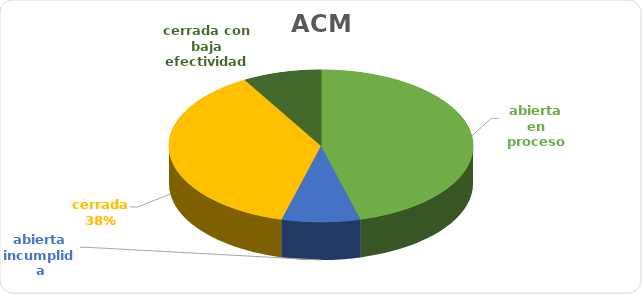
| Category | Series 0 |
|---|---|
| abierta en proceso | 11 |
| abierta incumplida | 2 |
| cerrada | 9 |
| cerrada con baja efectividad | 2 |